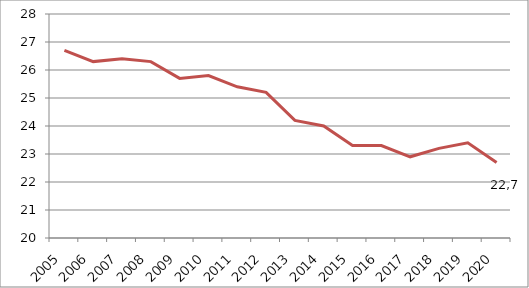
| Category | Series 1 |
|---|---|
| 2005.0 | 26.7 |
| 2006.0 | 26.3 |
| 2007.0 | 26.4 |
| 2008.0 | 26.3 |
| 2009.0 | 25.7 |
| 2010.0 | 25.8 |
| 2011.0 | 25.4 |
| 2012.0 | 25.2 |
| 2013.0 | 24.2 |
| 2014.0 | 24 |
| 2015.0 | 23.3 |
| 2016.0 | 23.3 |
| 2017.0 | 22.9 |
| 2018.0 | 23.2 |
| 2019.0 | 23.4 |
| 2020.0 | 22.7 |